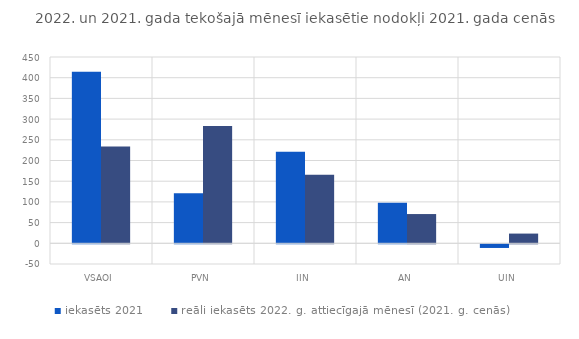
| Category | iekasēts 2021 | reāli iekasēts 2022. g. attiecīgajā mēnesī (2021. g. cenās) |
|---|---|---|
| VSAOI | 414.233 | 233.518 |
| PVN | 120.891 | 283.113 |
| IIN | 220.865 | 165.435 |
| AN | 98.123 | 70.666 |
| UIN | -8.843 | 23.481 |